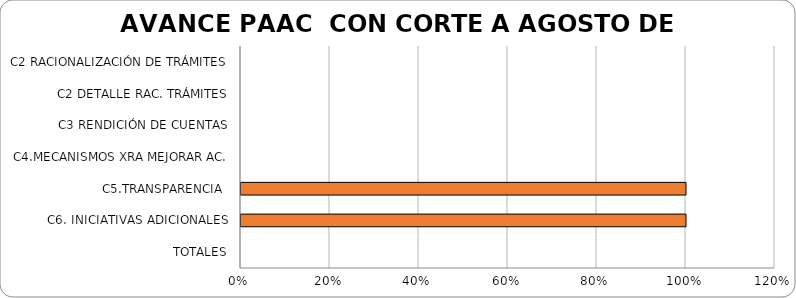
| Category | % AVANCE |
|---|---|
| C2 RACIONALIZACIÓN DE TRÁMITES | 0 |
| C2 DETALLE RAC. TRÁMITES | 0 |
| C3 RENDICIÓN DE CUENTAS | 0 |
| C4.MECANISMOS XRA MEJORAR AC. | 0 |
| C5.TRANSPARENCIA  | 1 |
| C6. INICIATIVAS ADICIONALES | 1 |
| TOTALES | 0 |